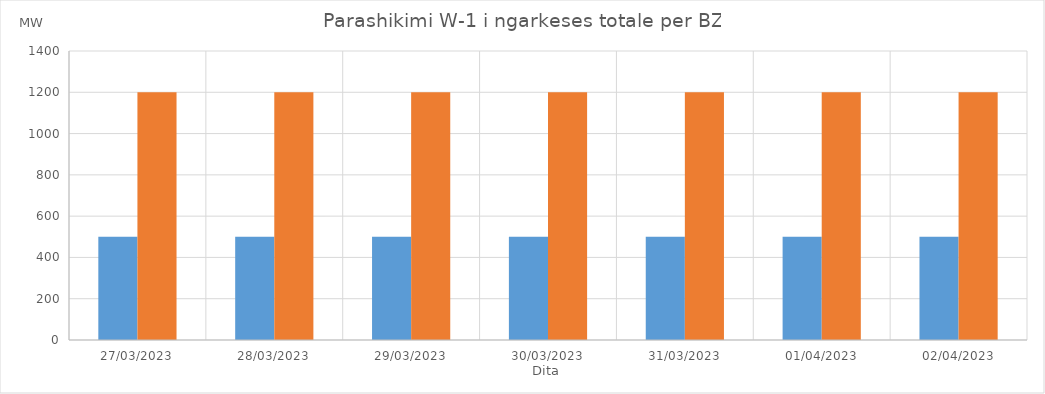
| Category | Min (MW) | Max (MW) |
|---|---|---|
| 27/03/2023 | 500 | 1200 |
| 28/03/2023 | 500 | 1200 |
| 29/03/2023 | 500 | 1200 |
| 30/03/2023 | 500 | 1200 |
| 31/03/2023 | 500 | 1200 |
| 01/04/2023 | 500 | 1200 |
| 02/04/2023 | 500 | 1200 |